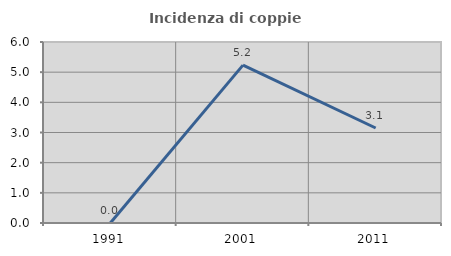
| Category | Incidenza di coppie miste |
|---|---|
| 1991.0 | 0 |
| 2001.0 | 5.233 |
| 2011.0 | 3.15 |